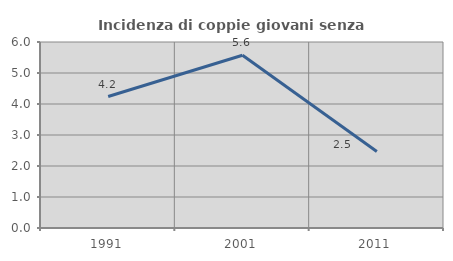
| Category | Incidenza di coppie giovani senza figli |
|---|---|
| 1991.0 | 4.241 |
| 2001.0 | 5.573 |
| 2011.0 | 2.469 |